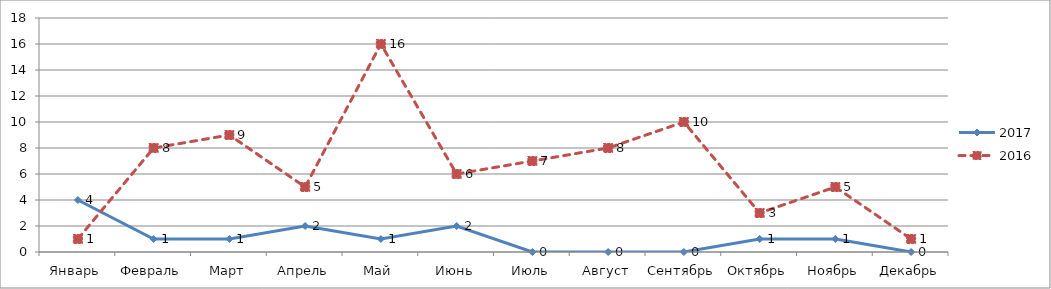
| Category | 2017 | 2016 |
|---|---|---|
| Январь | 4 | 1 |
| Февраль | 1 | 8 |
| Март | 1 | 9 |
| Апрель | 2 | 5 |
| Май | 1 | 16 |
| Июнь | 2 | 6 |
| Июль | 0 | 7 |
| Август | 0 | 8 |
| Сентябрь | 0 | 10 |
| Октябрь | 1 | 3 |
| Ноябрь | 1 | 5 |
| Декабрь | 0 | 1 |